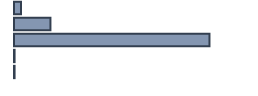
| Category | Percentatge |
|---|---|
| 0 | 2.892 |
| 1 | 15.181 |
| 2 | 81.446 |
| 3 | 0.241 |
| 4 | 0.241 |